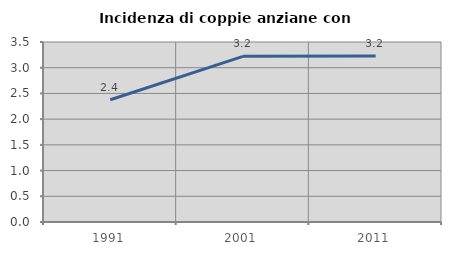
| Category | Incidenza di coppie anziane con figli |
|---|---|
| 1991.0 | 2.377 |
| 2001.0 | 3.221 |
| 2011.0 | 3.226 |